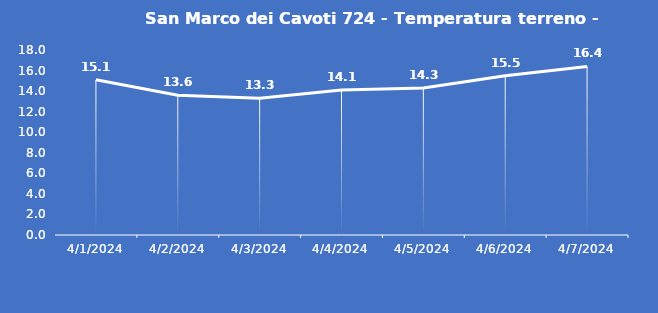
| Category | San Marco dei Cavoti 724 - Temperatura terreno - Grezzo (°C) |
|---|---|
| 4/1/24 | 15.1 |
| 4/2/24 | 13.6 |
| 4/3/24 | 13.3 |
| 4/4/24 | 14.1 |
| 4/5/24 | 14.3 |
| 4/6/24 | 15.5 |
| 4/7/24 | 16.4 |